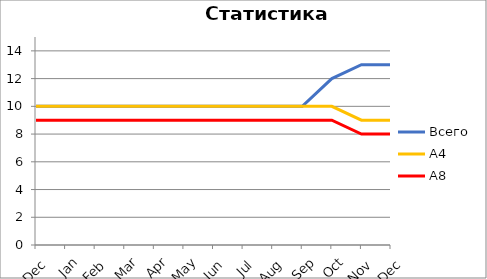
| Category | Всего | А4 | A8 |
|---|---|---|---|
| 0 | 10 | 10 | 9 |
| 1 | 10 | 10 | 9 |
| 2 | 10 | 10 | 9 |
| 3 | 10 | 10 | 9 |
| 4 | 10 | 10 | 9 |
| 5 | 10 | 10 | 9 |
| 6 | 10 | 10 | 9 |
| 7 | 10 | 10 | 9 |
| 8 | 10 | 10 | 9 |
| 9 | 10 | 10 | 9 |
| 10 | 12 | 10 | 9 |
| 11 | 13 | 9 | 8 |
| 12 | 13 | 9 | 8 |